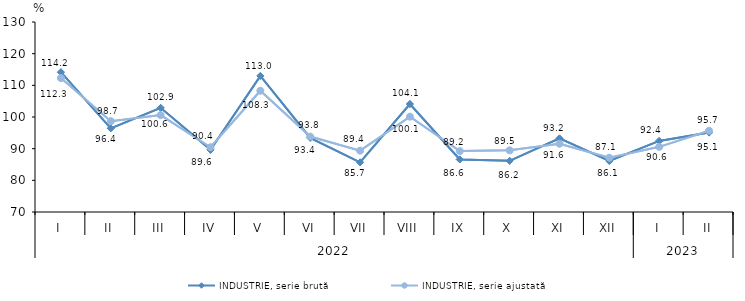
| Category | INDUSTRIE, serie brută | INDUSTRIE, serie ajustată |
|---|---|---|
| 0 | 114.151 | 112.283 |
| 1 | 96.419 | 98.68 |
| 2 | 102.886 | 100.594 |
| 3 | 89.614 | 90.447 |
| 4 | 112.973 | 108.294 |
| 5 | 93.417 | 93.82 |
| 6 | 85.678 | 89.372 |
| 7 | 104.099 | 100.102 |
| 8 | 86.603 | 89.228 |
| 9 | 86.164 | 89.466 |
| 10 | 93.241 | 91.558 |
| 11 | 86.103 | 87.134 |
| 12 | 92.442 | 90.58 |
| 13 | 95.078 | 95.675 |